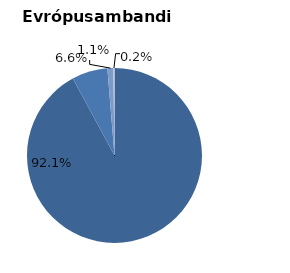
| Category | EU27 |
|---|---|
| Örfyrirtæki (1 - 9) | 0.921 |
| Lítil (10 - 49) | 0.066 |
| Meðalstór (50-249) | 0.011 |
| Stór (> 250) | 0.002 |